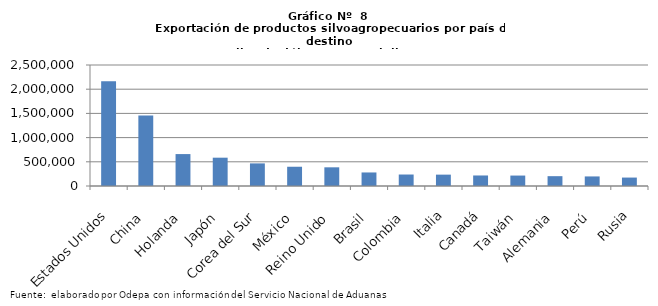
| Category | Series 0 |
|---|---|
| Estados Unidos | 2166459.659 |
| China | 1456265.084 |
| Holanda | 659545.826 |
| Japón | 584993.632 |
| Corea del Sur | 467127.336 |
| México | 397828.536 |
| Reino Unido | 386042.309 |
| Brasil | 279736.265 |
| Colombia | 237311.359 |
| Italia | 234859.612 |
| Canadá | 217425.818 |
| Taiwán | 215693.144 |
| Alemania | 203171.17 |
| Perú | 197762.499 |
| Rusia | 174212.433 |